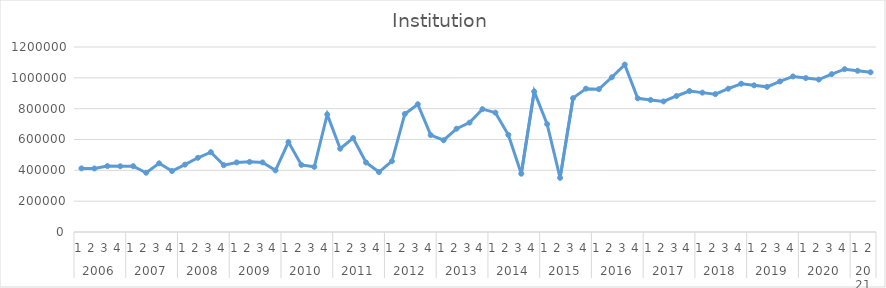
| Category | Institution |
|---|---|
| 0 | 412632 |
| 1 | 411934 |
| 2 | 427725 |
| 3 | 426417 |
| 4 | 426980 |
| 5 | 384257 |
| 6 | 445402 |
| 7 | 395387 |
| 8 | 436969 |
| 9 | 481370 |
| 10 | 517793 |
| 11 | 433644 |
| 12 | 451273 |
| 13 | 454875 |
| 14 | 451247 |
| 15 | 399568 |
| 16 | 583127 |
| 17 | 435191 |
| 18 | 422561 |
| 19 | 762731 |
| 20 | 540178 |
| 21 | 609575 |
| 22 | 450868 |
| 23 | 388873 |
| 24 | 459491 |
| 25 | 765836 |
| 26 | 828756 |
| 27 | 628558 |
| 28 | 595184 |
| 29 | 670174 |
| 30 | 709453 |
| 31 | 796729 |
| 32 | 774023 |
| 33 | 630110 |
| 34 | 378181 |
| 35 | 911393 |
| 36 | 699658 |
| 37 | 351109 |
| 38 | 868177 |
| 39 | 929756 |
| 40 | 926567 |
| 41 | 1003575 |
| 42 | 1085893 |
| 43 | 867170.093 |
| 44 | 856768.72 |
| 45 | 846943.629 |
| 46 | 882220.902 |
| 47 | 914418.183 |
| 48 | 904016.81 |
| 49 | 894191.719 |
| 50 | 929468.992 |
| 51 | 961666.273 |
| 52 | 951264.899 |
| 53 | 941439.808 |
| 54 | 976717.081 |
| 55 | 1008914.362 |
| 56 | 998512.989 |
| 57 | 988687.898 |
| 58 | 1023965.171 |
| 59 | 1056162.452 |
| 60 | 1045761.079 |
| 61 | 1035935.988 |